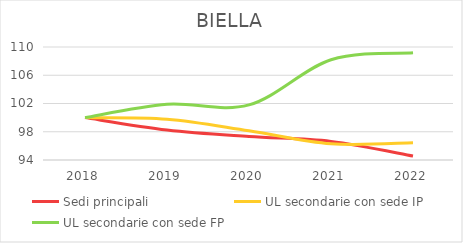
| Category | Sedi principali | UL secondarie con sede IP | UL secondarie con sede FP |
|---|---|---|---|
| 2018.0 | 100 | 100 | 100 |
| 2019.0 | 98.25 | 99.786 | 101.89 |
| 2020.0 | 97.317 | 98.147 | 101.8 |
| 2021.0 | 96.636 | 96.294 | 108.191 |
| 2022.0 | 94.571 | 96.436 | 109.181 |